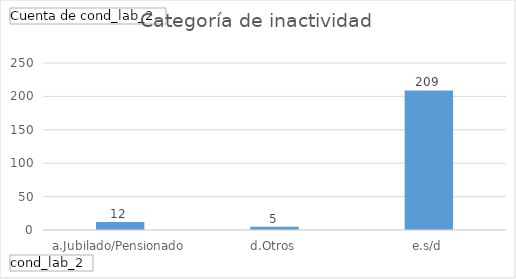
| Category | Total |
|---|---|
| a.Jubilado/Pensionado | 12 |
| d.Otros | 5 |
| e.s/d | 209 |